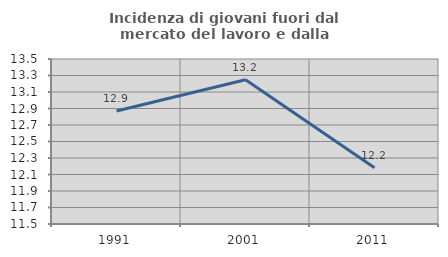
| Category | Incidenza di giovani fuori dal mercato del lavoro e dalla formazione  |
|---|---|
| 1991.0 | 12.87 |
| 2001.0 | 13.248 |
| 2011.0 | 12.182 |